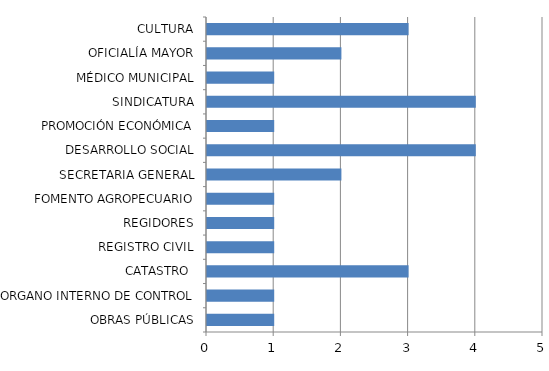
| Category | Series 0 |
|---|---|
| OBRAS PÚBLICAS | 1 |
| ORGANO INTERNO DE CONTROL | 1 |
| CATASTRO  | 3 |
| REGISTRO CIVIL | 1 |
| REGIDORES | 1 |
| FOMENTO AGROPECUARIO | 1 |
| SECRETARIA GENERAL | 2 |
| DESARROLLO SOCIAL | 4 |
| PROMOCIÓN ECONÓMICA | 1 |
| SINDICATURA | 4 |
| MÉDICO MUNICIPAL | 1 |
| OFICIALÍA MAYOR | 2 |
| CULTURA | 3 |